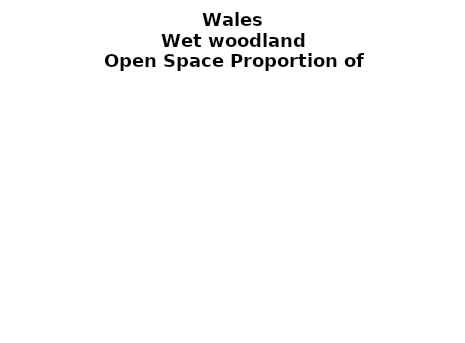
| Category | Wet woodland |
|---|---|
|  ≥ 10ha, < 10%  | 0.115 |
|   ≥ 10ha, 10-25% | 0.063 |
|   ≥ 10ha, > 25 and <50%  | 0.141 |
|   ≥ 10ha, ≥ 50%  | 0.177 |
|  < 10ha, < 10% | 0.048 |
|  < 10ha, 10-25% | 0.056 |
|  < 10ha, > 25 and < 50% | 0.146 |
|  < 10ha, ≥ 50% | 0.254 |